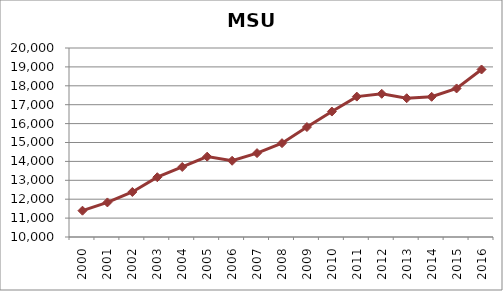
| Category | Series 0 |
|---|---|
| 2000.0 | 11391.842 |
| 2001.0 | 11828.958 |
| 2002.0 | 12382.175 |
| 2003.0 | 13162.9 |
| 2004.0 | 13704.583 |
| 2005.0 | 14251.667 |
| 2006.0 | 14034.2 |
| 2007.0 | 14437.867 |
| 2008.0 | 14964.492 |
| 2009.0 | 15816.942 |
| 2010.0 | 16638.075 |
| 2011.0 | 17428.083 |
| 2012.0 | 17577.2 |
| 2013.0 | 17342.175 |
| 2014.0 | 17418.133 |
| 2015.0 | 17859.9 |
| 2016.0 | 18863.217 |